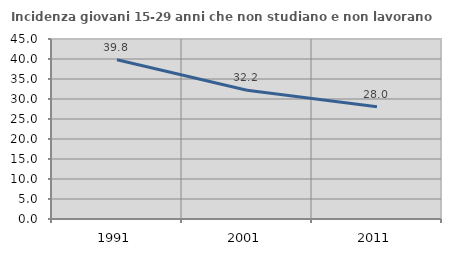
| Category | Incidenza giovani 15-29 anni che non studiano e non lavorano  |
|---|---|
| 1991.0 | 39.806 |
| 2001.0 | 32.177 |
| 2011.0 | 28.049 |